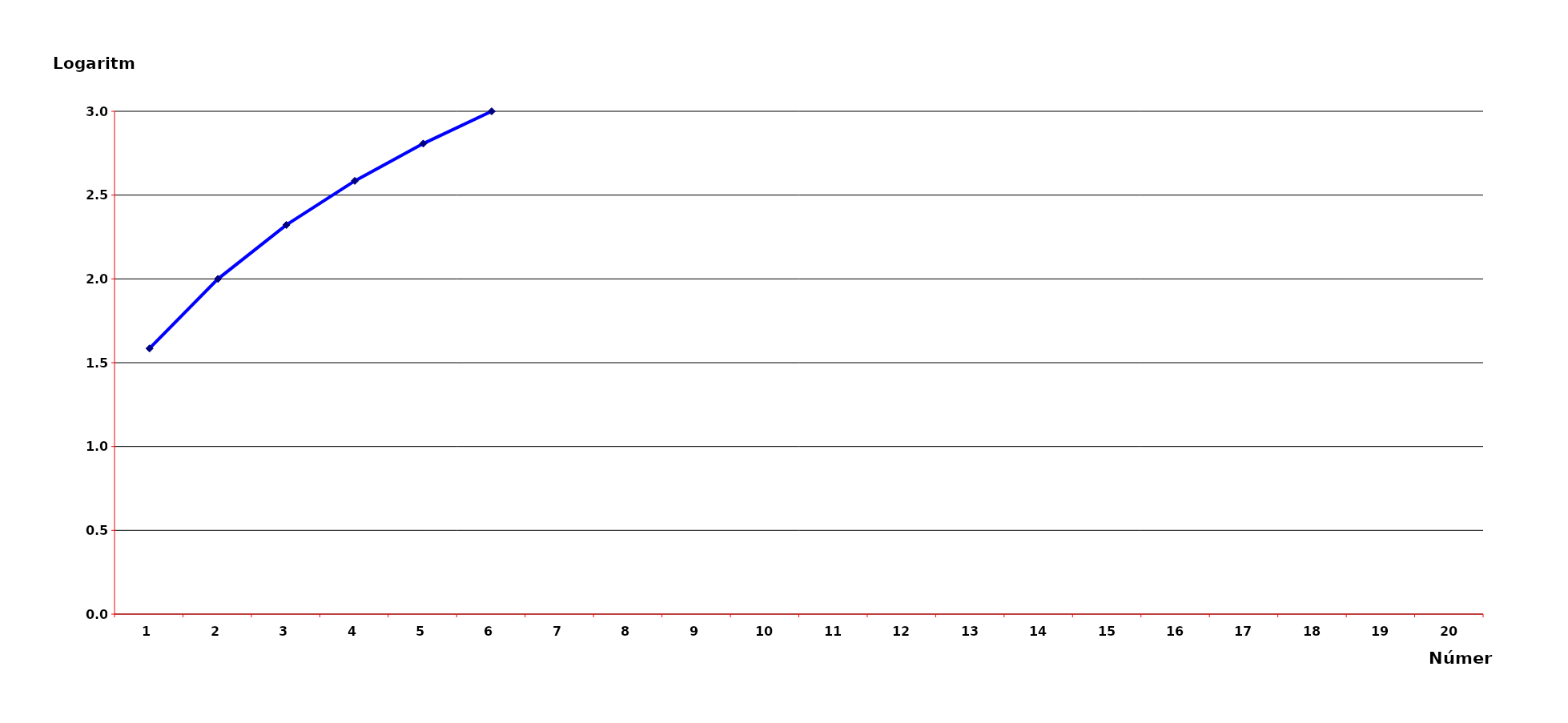
| Category | Gráfico Função Logaritmica |
|---|---|
| 0 | 1.585 |
| 1 | 2 |
| 2 | 2.322 |
| 3 | 2.585 |
| 4 | 2.807 |
| 5 | 3 |
| 6 | 3.17 |
| 7 | 3.322 |
| 8 | 3.459 |
| 9 | 3.585 |
| 10 | 3.7 |
| 11 | 3.807 |
| 12 | 3.907 |
| 13 | 4 |
| 14 | 4.087 |
| 15 | 4.17 |
| 16 | 4.248 |
| 17 | 4.322 |
| 18 | 4.392 |
| 19 | 4.459 |